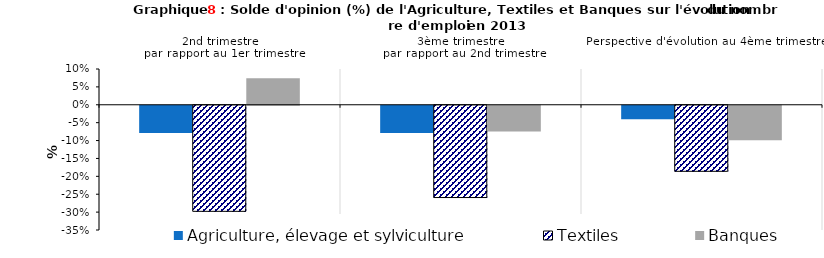
| Category | Agriculture, élevage et sylviculture | Textiles | Banques |
|---|---|---|---|
| 2nd trimestre 
par rapport au 1er trimestre | -0.076 | -0.296 | 0.074 |
| 3ème trimestre 
par rapport au 2nd trimestre | -0.076 | -0.258 | -0.072 |
| Perspective d'évolution au 4ème trimestre | -0.038 | -0.185 | -0.096 |